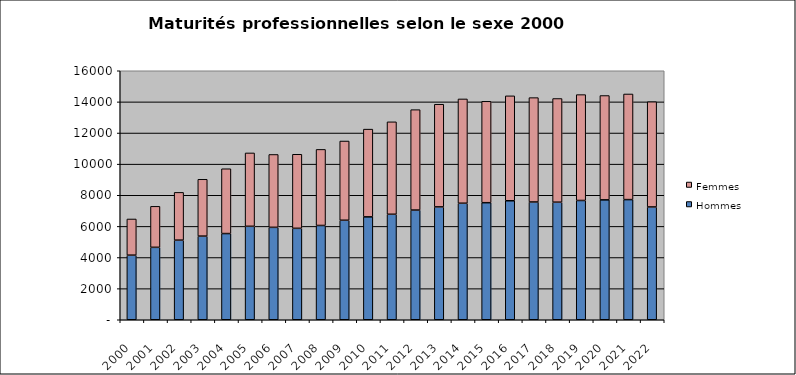
| Category | Hommes | Femmes |
|---|---|---|
| 2000.0 | 4151 | 2324 |
| 2001.0 | 4654 | 2635 |
| 2002.0 | 5116 | 3069 |
| 2003.0 | 5374 | 3653 |
| 2004.0 | 5539 | 4164 |
| 2005.0 | 6005 | 4714 |
| 2006.0 | 5938 | 4683 |
| 2007.0 | 5875 | 4759 |
| 2008.0 | 6058 | 4888 |
| 2009.0 | 6394 | 5091 |
| 2010.0 | 6612 | 5637 |
| 2011.0 | 6779 | 5939 |
| 2012.0 | 7049 | 6452 |
| 2013.0 | 7253 | 6596 |
| 2014.0 | 7487 | 6702 |
| 2015.0 | 7522 | 6516 |
| 2016.0 | 7646 | 6742 |
| 2017.0 | 7568 | 6706 |
| 2018.0 | 7555 | 6661 |
| 2019.0 | 7664 | 6803 |
| 2020.0 | 7704 | 6704 |
| 2021.0 | 7720 | 6788 |
| 2022.0 | 7248 | 6764 |